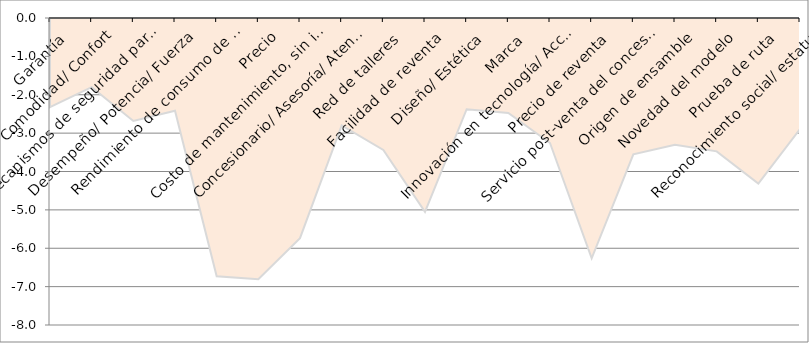
| Category | DESVIACIÓN FRENTE A IDEAL |
|---|---|
| Garantía | -2.324 |
| Comodidad/ Confort | -1.802 |
| Mecanismos de seguridad para reducir riesgos o lesiones en caso de accidentes | -2.682 |
| Desempeño/ Potencia/ Fuerza | -2.419 |
| Rendimiento de consumo de gasolina | -6.731 |
| Precio | -6.809 |
| Costo de mantenimiento, sin incluir el consumo de la gasolina | -5.737 |
| Concesionario/ Asesoría/ Atención | -2.8 |
| Red de talleres | -3.439 |
| Facilidad de reventa | -5.05 |
| Diseño/ Estética | -2.377 |
| Marca | -2.474 |
| Innovación en tecnología/ Accesorios | -3.258 |
| Precio de reventa | -6.261 |
| Servicio post-venta del concesionario | -3.553 |
| Origen de ensamble | -3.305 |
| Novedad del modelo | -3.475 |
| Prueba de ruta | -4.314 |
| Reconocimiento social/ estatus | -2.894 |